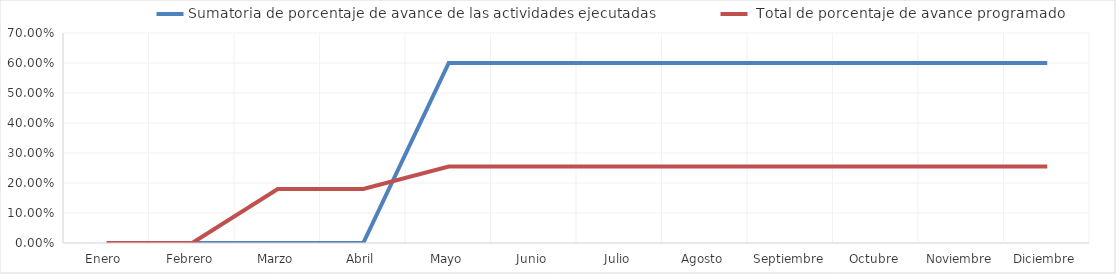
| Category | Sumatoria de porcentaje de avance de las actividades ejecutadas |  Total de porcentaje de avance programado |
|---|---|---|
| Enero  | 0 | 0 |
| Febrero | 0 | 0 |
| Marzo | 0 | 0.18 |
| Abril | 0 | 0.18 |
| Mayo | 0.6 | 0.255 |
| Junio | 0.6 | 0.255 |
| Julio | 0.6 | 0.255 |
| Agosto | 0.6 | 0.255 |
| Septiembre | 0.6 | 0.255 |
| Octubre | 0.6 | 0.255 |
| Noviembre | 0.6 | 0.255 |
| Diciembre | 0.6 | 0.255 |